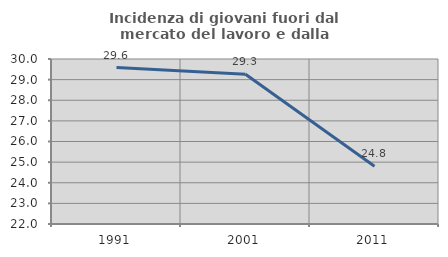
| Category | Incidenza di giovani fuori dal mercato del lavoro e dalla formazione  |
|---|---|
| 1991.0 | 29.582 |
| 2001.0 | 29.263 |
| 2011.0 | 24.8 |